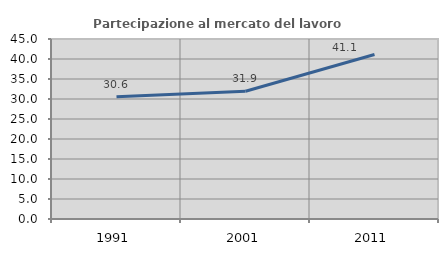
| Category | Partecipazione al mercato del lavoro  femminile |
|---|---|
| 1991.0 | 30.576 |
| 2001.0 | 31.939 |
| 2011.0 | 41.117 |